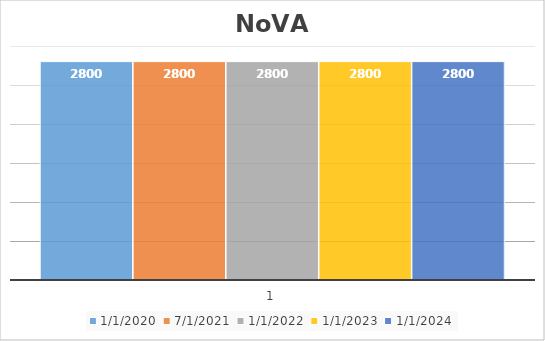
| Category | 01.01.2020 | 01.07.2021 | 01.01.2022 | 01.01.2023 | 01.01.2024 |
|---|---|---|---|---|---|
| 0 | 2800 | 2800 | 2800 | 2800 | 2800 |